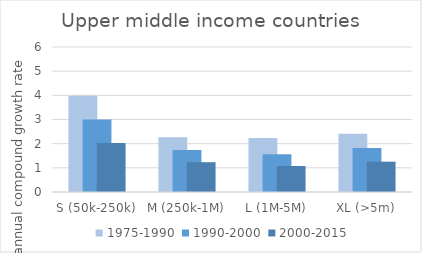
| Category | 1975-1990 | 1990-2000 | 2000-2015 |
|---|---|---|---|
| S (50k-250k) | 3.988 | 2.999 | 2.024 |
| M (250k-1M) | 2.264 | 1.738 | 1.233 |
| L (1M-5M) | 2.23 | 1.564 | 1.076 |
| XL (>5m) | 2.409 | 1.821 | 1.255 |